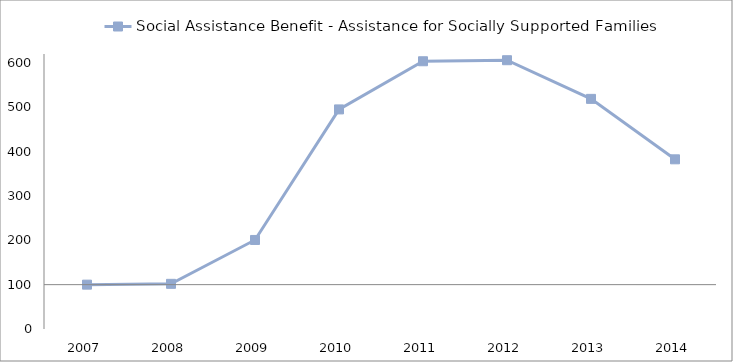
| Category | Social Assistance Benefit - Assistance for Socially Supported Families | 0 |
|---|---|---|
| 2007.0 | 100 |  |
| 2008.0 | 101.832 |  |
| 2009.0 | 200.74 |  |
| 2010.0 | 495.071 |  |
| 2011.0 | 603.648 |  |
| 2012.0 | 605.994 |  |
| 2013.0 | 518.828 |  |
| 2014.0 | 382.567 |  |